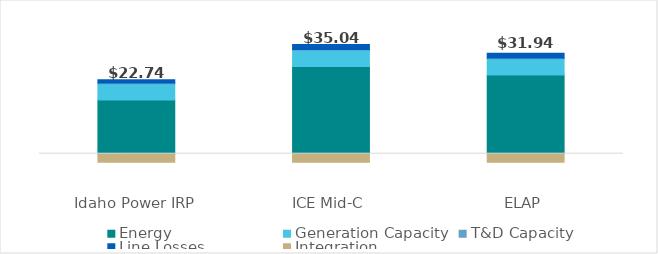
| Category | Energy | Generation Capacity | T&D Capacity | Line Losses | Integration |
|---|---|---|---|---|---|
| 0 | 18.651 | 5.629 | 0.307 | 1.082 | -2.93 |
| 1 | 30.278 | 5.629 | 0.307 | 1.756 | -2.93 |
| 2 | 27.343 | 5.629 | 0.307 | 1.586 | -2.93 |